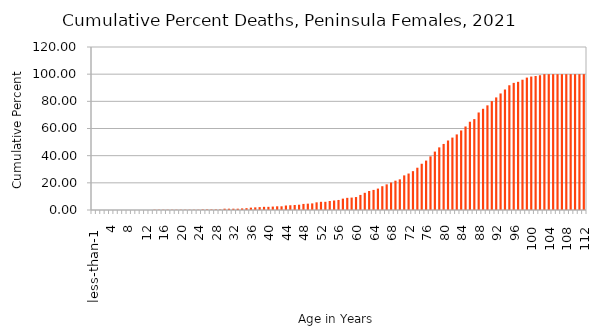
| Category | Series 0 |
|---|---|
| less-than-1  | 0 |
| 1 | 0 |
| 2 | 0 |
| 3 | 0 |
| 4 | 0 |
| 5 | 0 |
| 6 | 0 |
| 7 | 0 |
| 8 | 0 |
| 9 | 0 |
| 10 | 0 |
| 11 | 0 |
| 12 | 0 |
| 13 | 0 |
| 14 | 0.195 |
| 15 | 0.195 |
| 16 | 0.195 |
| 17 | 0.195 |
| 18 | 0.195 |
| 19 | 0.195 |
| 20 | 0.195 |
| 21 | 0.195 |
| 22 | 0.195 |
| 23 | 0.195 |
| 24 | 0.195 |
| 25 | 0.389 |
| 26 | 0.389 |
| 27 | 0.389 |
| 28 | 0.389 |
| 29 | 0.389 |
| 30 | 0.973 |
| 31 | 0.973 |
| 32 | 0.973 |
| 33 | 0.973 |
| 34 | 1.167 |
| 35 | 1.362 |
| 36 | 1.751 |
| 37 | 1.946 |
| 38 | 2.14 |
| 39 | 2.335 |
| 40 | 2.335 |
| 41 | 2.529 |
| 42 | 2.724 |
| 43 | 2.724 |
| 44 | 3.307 |
| 45 | 3.502 |
| 46 | 3.696 |
| 47 | 3.891 |
| 48 | 4.475 |
| 49 | 4.669 |
| 50 | 4.864 |
| 51 | 5.642 |
| 52 | 6.031 |
| 53 | 6.031 |
| 54 | 6.615 |
| 55 | 7.004 |
| 56 | 7.393 |
| 57 | 8.366 |
| 58 | 8.949 |
| 59 | 9.144 |
| 60 | 9.533 |
| 61 | 11.089 |
| 62 | 12.646 |
| 63 | 14.008 |
| 64 | 14.786 |
| 65 | 15.759 |
| 66 | 17.51 |
| 67 | 18.872 |
| 68 | 20.233 |
| 69 | 21.595 |
| 70 | 22.568 |
| 71 | 25.486 |
| 72 | 26.848 |
| 73 | 28.599 |
| 74 | 31.128 |
| 75 | 34.047 |
| 76 | 36.381 |
| 77 | 39.494 |
| 78 | 42.996 |
| 79 | 46.109 |
| 80 | 48.638 |
| 81 | 51.167 |
| 82 | 53.307 |
| 83 | 55.642 |
| 84 | 58.56 |
| 85 | 61.479 |
| 86 | 64.981 |
| 87 | 66.926 |
| 88 | 71.79 |
| 89 | 74.514 |
| 90 | 77.043 |
| 91 | 80.156 |
| 92 | 82.879 |
| 93 | 85.798 |
| 94 | 88.716 |
| 95 | 91.829 |
| 96 | 93.58 |
| 97 | 94.358 |
| 98 | 95.914 |
| 99 | 97.471 |
| 100 | 98.249 |
| 101 | 98.638 |
| 102 | 99.222 |
| 103 | 100 |
| 104 | 100 |
| 105 | 100 |
| 106 | 100 |
| 107 | 100 |
| 108 | 100 |
| 109 | 100 |
| 110 | 100 |
| 111 | 100 |
| 112 | 100 |